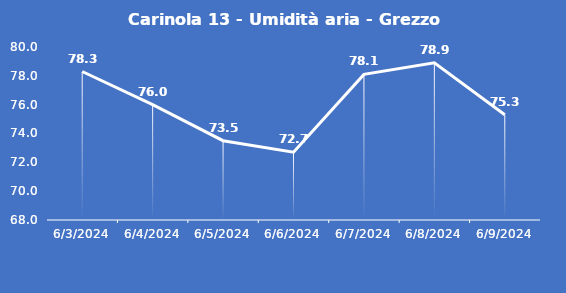
| Category | Carinola 13 - Umidità aria - Grezzo (%) |
|---|---|
| 6/3/24 | 78.3 |
| 6/4/24 | 76 |
| 6/5/24 | 73.5 |
| 6/6/24 | 72.7 |
| 6/7/24 | 78.1 |
| 6/8/24 | 78.9 |
| 6/9/24 | 75.3 |